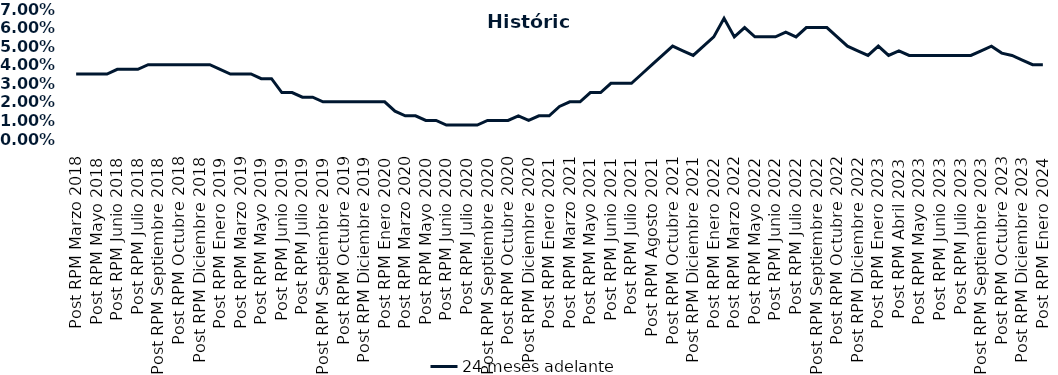
| Category | 24 meses adelante  |
|---|---|
| Post RPM Marzo 2018 | 0.035 |
| Pre RPM Mayo 2018 | 0.035 |
| Post RPM Mayo 2018 | 0.035 |
| Pre RPM Junio 2018 | 0.035 |
| Post RPM Junio 2018 | 0.038 |
| Pre RPM Julio 2018 | 0.038 |
| Post RPM Julio 2018 | 0.038 |
| Pre RPM Septiembre 2018 | 0.04 |
| Post RPM Septiembre 2018 | 0.04 |
| Pre RPM Octubre 2018 | 0.04 |
| Post RPM Octubre 2018 | 0.04 |
| Pre RPM Diciembre 2018 | 0.04 |
| Post RPM Diciembre 2018 | 0.04 |
| Pre RPM Enero 2019 | 0.04 |
| Post RPM Enero 2019 | 0.038 |
| Pre RPM Marzo 2019 | 0.035 |
| Post RPM Marzo 2019 | 0.035 |
| Pre RPM Mayo 2019 | 0.035 |
| Post RPM Mayo 2019 | 0.032 |
| Pre RPM Junio 2019 | 0.032 |
| Post RPM Junio 2019 | 0.025 |
| Pre RPM Julio 2019 | 0.025 |
| Post RPM Julio 2019 | 0.022 |
| Pre RPM Septiembre 2019 | 0.022 |
| Post RPM Septiembre 2019 | 0.02 |
| Pre RPM Octubre 2019 | 0.02 |
| Post RPM Octubre 2019 | 0.02 |
| Pre RPM Diciembre 2019 | 0.02 |
| Post RPM Diciembre 2019 | 0.02 |
| Pre RPM Enero 2020 | 0.02 |
| Post RPM Enero 2020 | 0.02 |
| Pre RPM Marzo 2020 | 0.015 |
| Post RPM Marzo 2020 | 0.012 |
| Pre RPM Mayo 2020 | 0.012 |
| Post RPM Mayo 2020 | 0.01 |
| Pre RPM Junio 2020 | 0.01 |
| Post RPM Junio 2020 | 0.008 |
| Pre RPM Julio 2020 | 0.008 |
| Post RPM Julio 2020 | 0.008 |
| Pre RPM Septiembre 2020 | 0.008 |
| Post RPM Septiembre 2020 | 0.01 |
| Pre RPM Octubre 2020 | 0.01 |
| Post RPM Octubre 2020 | 0.01 |
| Pre RPM Diciembre 2020 | 0.012 |
| Post RPM Diciembre 2020 | 0.01 |
| Pre RPM Enero 2021 | 0.012 |
| Post RPM Enero 2021 | 0.012 |
| Pre RPM Marzo 2021 | 0.018 |
| Post RPM Marzo 2021 | 0.02 |
| Pre RPM Mayo 2021 | 0.02 |
| Post RPM Mayo 2021 | 0.025 |
| Pre RPM Junio 2021 | 0.025 |
| Post RPM Junio 2021 | 0.03 |
| Pre RPM Julio 2021 | 0.03 |
| Post RPM Julio 2021 | 0.03 |
| Pre RPM Agosto 2021 | 0.035 |
| Post RPM Agosto 2021 | 0.04 |
| Pre RPM Octubre 2021 | 0.045 |
| Post RPM Octubre 2021 | 0.05 |
| Pre RPM Diciembre 2021 | 0.048 |
| Post RPM Diciembre 2021 | 0.045 |
| Pre RPM Enero 2022 | 0.05 |
| Post RPM Enero 2022 | 0.055 |
| Pre RPM Marzo 2022 | 0.065 |
| Post RPM Marzo 2022 | 0.055 |
| Pre RPM Mayo 2022 | 0.06 |
| Post RPM Mayo 2022 | 0.055 |
| Pre RPM Junio 2022 | 0.055 |
| Post RPM Junio 2022 | 0.055 |
| Pre RPM Julio 2022 | 0.058 |
| Post RPM Julio 2022 | 0.055 |
| Pre RPM Septiembre 2022 | 0.06 |
| Post RPM Septiembre 2022 | 0.06 |
| Pre RPM Octubre 2022 | 0.06 |
| Post RPM Octubre 2022 | 0.055 |
| Pre RPM Diciembre 2022 | 0.05 |
| Post RPM Diciembre 2022 | 0.048 |
| Pre RPM Enero 2023 | 0.045 |
| Post RPM Enero 2023 | 0.05 |
| Pre RPM Abril 2023 | 0.045 |
| Post RPM Abril 2023 | 0.048 |
| Pre RPM Mayo 2023 | 0.045 |
| Post RPM Mayo 2023 | 0.045 |
| Pre RPM Junio 2023 | 0.045 |
| Post RPM Junio 2023 | 0.045 |
| Pre RPM Julio 2023 | 0.045 |
| Post RPM Julio 2023 | 0.045 |
| Pre RPM Septiembre 2023 | 0.045 |
| Post RPM Septiembre 2023 | 0.048 |
| Pre RPM Octubre 2023 | 0.05 |
| Post RPM Octubre 2023 | 0.046 |
| Pre RPM Diciembre 2023 | 0.045 |
| Post RPM Diciembre 2023 | 0.042 |
| Pre RPM Enero 2024 | 0.04 |
| Post RPM Enero 2024 | 0.04 |